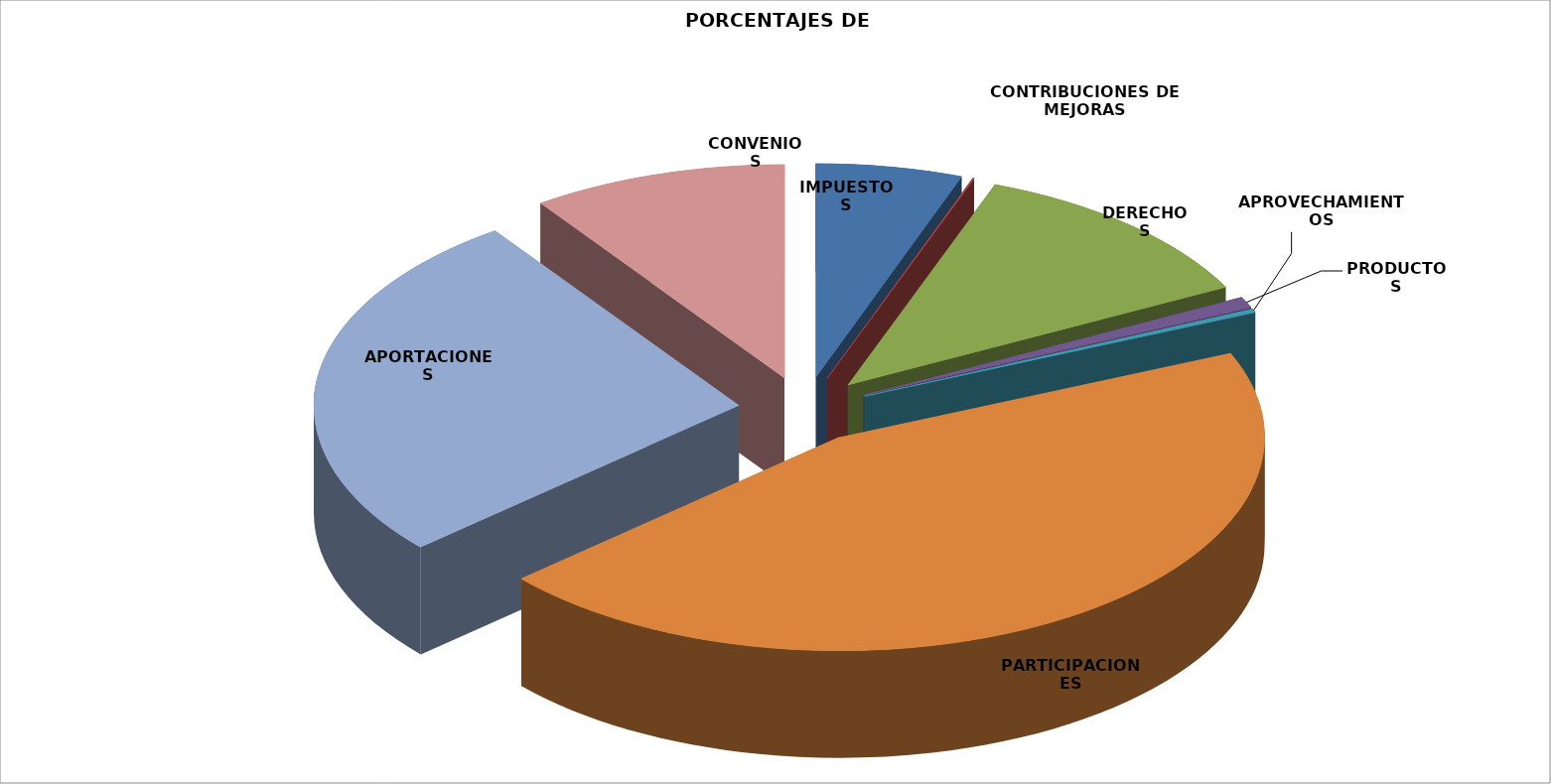
| Category | TOTAL | PORCENTAJE |
|---|---|---|
| IMPUESTOS | 2034609.84 | 0.056 |
| CONTRIBUCIONES DE MEJORAS | 20000 | 0.001 |
| DERECHOS | 4306573.611 | 0.118 |
| PRODUCTOS | 308428.47 | 0.008 |
| APROVECHAMIENTOS | 107386.96 | 0.003 |
| PARTICIPACIONES | 16400346.2 | 0.449 |
| APORTACIONES | 9794927.46 | 0.268 |
| CONVENIOS | 3552623.26 | 0.097 |